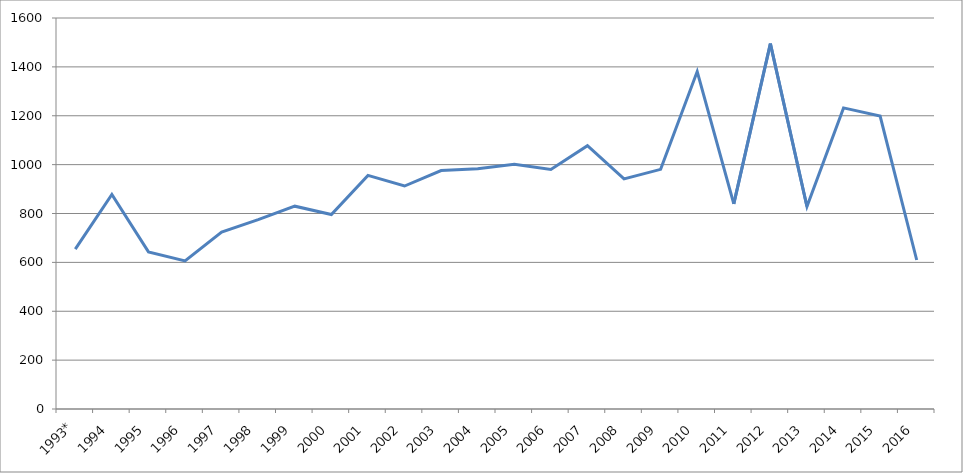
| Category | Series 0 |
|---|---|
| 1993* | 654 |
| 1994 | 878 |
| 1995 | 643 |
| 1996 | 606 |
| 1997 | 724 |
| 1998 | 775 |
| 1999 | 830 |
| 2000 | 795.8 |
| 2001 | 956 |
| 2002 | 912.5 |
| 2003 | 975.7 |
| 2004 | 983.05 |
| 2005 | 1001.8 |
| 2006 | 980 |
| 2007 | 1077.5 |
| 2008 | 941.8 |
| 2009 | 980.7 |
| 2010 | 1380.7 |
| 2011 | 839.2 |
| 2012 | 1495.2 |
| 2013 | 828.7 |
| 2014 | 1232.2 |
| 2015 | 1198.5 |
| 2016 | 609.7 |